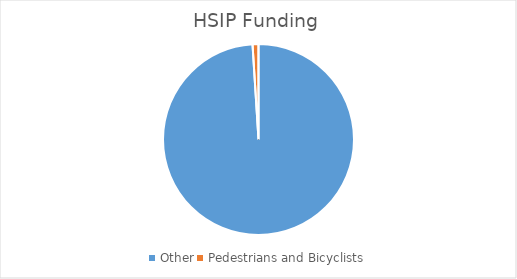
| Category | HSIP Funding |
|---|---|
| Other | 0.99 |
| Pedestrians and Bicyclists | 0.01 |